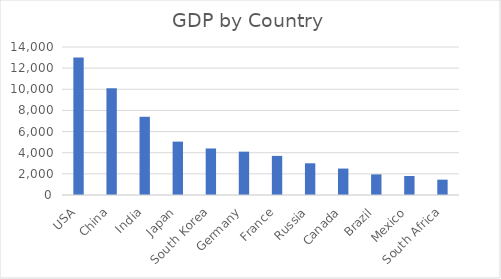
| Category | Total GDP ($B) |
|---|---|
| USA | 13000 |
| China | 10100 |
| India | 7400 |
| Japan | 5050 |
| South Korea | 4400 |
| Germany | 4100 |
| France | 3700 |
| Russia | 3000 |
| Canada | 2500 |
| Brazil | 1950 |
| Mexico | 1800 |
| South Africa | 1450 |